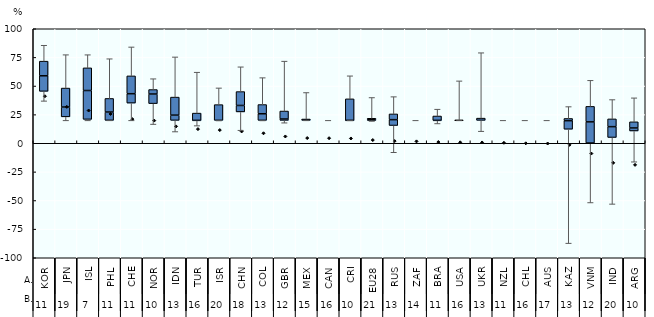
| Category | Q1 | Median-Q1 | Q3-Median |
|---|---|---|---|
| 0 | 131.683 | 16.982 | 15.973 |
| 1 | 103.845 | 10.704 | 20.709 |
| 2 | 101.091 | 31.484 | 24.744 |
| 3 | 100 | 9.091 | 14.82 |
| 4 | 118.856 | 10.246 | 19.45 |
| 5 | 118.277 | 10.46 | 4.895 |
| 6 | 100 | 5.695 | 19.706 |
| 7 | 99.768 | 0.232 | 7.933 |
| 8 | 100 | 0 | 17.184 |
| 9 | 109.226 | 7.024 | 15.176 |
| 10 | 100 | 7.196 | 10.066 |
| 11 | 100 | 1.465 | 8.724 |
| 12 | 100 | 0 | 1.462 |
| 13 | 100 | 0 | 0 |
| 14 | 100 | 0.01 | 23.469 |
| 15 | 100 | 0.68 | 1.606 |
| 16 | 94.378 | 6.372 | 6.27 |
| 17 | 100 | 0 | 0 |
| 18 | 99.596 | 0.404 | 4.756 |
| 19 | 100 | 0 | 0.077 |
| 20 | 100 | 0 | 2.433 |
| 21 | 100 | 0 | 0 |
| 22 | 100 | 0 | 0 |
| 23 | 100 | 0 | 0 |
| 24 | 90.311 | 9.329 | 2.417 |
| 25 | 75.24 | 23.101 | 16.916 |
| 26 | 81.315 | 11.816 | 8.476 |
| 27 | 88.409 | 3.306 | 6.699 |